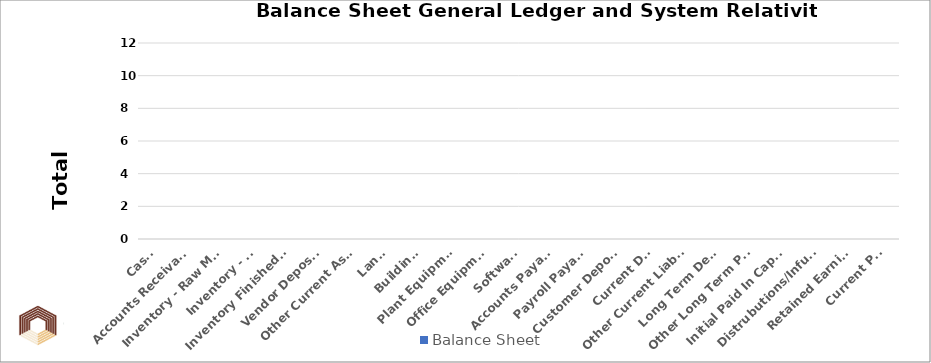
| Category | Balance Sheet  |
|---|---|
| Cash  | 0 |
| Accounts Receivable  | 0 |
| Inventory - Raw Materals  | 0 |
| Inventory - WIP  | 0 |
| Inventory Finished Goods | 0 |
| Vendor Deposits  | 0 |
| Other Current Assets | 0 |
| Land  | 0 |
| Buildings  | 0 |
| Plant Equipment  | 0 |
| Office Equipment  | 0 |
| Software  | 0 |
| Accounts Payable  | 0 |
| Payroll Payable  | 0 |
| Customer Deposits | 0 |
| Current Debt | 0 |
| Other Current Liabilities | 0 |
| Long Term Debt  | 0 |
| Other Long Term Payables | 0 |
| Initial Paid In Capital  | 0 |
| Distrubutions/Infusions  | 0 |
| Retained Earnings | 0 |
| Current P&L | 0 |